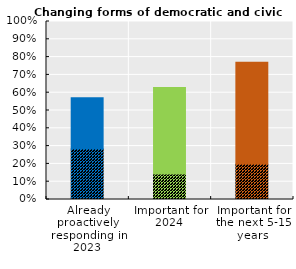
| Category | Changing forms of democratic and civic engagement | Series 1 |
|---|---|---|
| Already proactively responding in 2023 | 0.286 | 0.286 |
| Important for
2024 | 0.143 | 0.486 |
| Important for
the next 5-15 years | 0.2 | 0.571 |